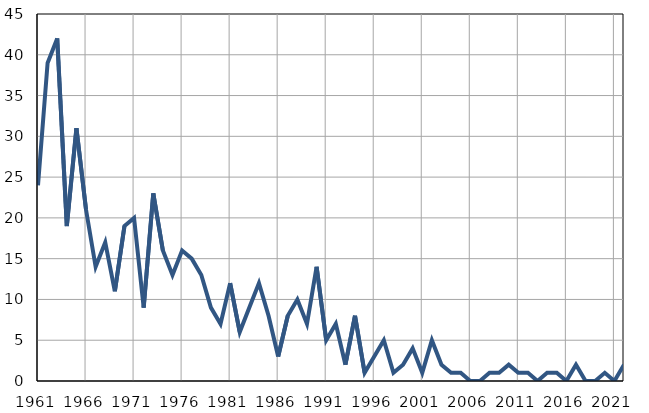
| Category | Infants
deaths |
|---|---|
| 1961.0 | 24 |
| 1962.0 | 39 |
| 1963.0 | 42 |
| 1964.0 | 19 |
| 1965.0 | 31 |
| 1966.0 | 21 |
| 1967.0 | 14 |
| 1968.0 | 17 |
| 1969.0 | 11 |
| 1970.0 | 19 |
| 1971.0 | 20 |
| 1972.0 | 9 |
| 1973.0 | 23 |
| 1974.0 | 16 |
| 1975.0 | 13 |
| 1976.0 | 16 |
| 1977.0 | 15 |
| 1978.0 | 13 |
| 1979.0 | 9 |
| 1980.0 | 7 |
| 1981.0 | 12 |
| 1982.0 | 6 |
| 1983.0 | 9 |
| 1984.0 | 12 |
| 1985.0 | 8 |
| 1986.0 | 3 |
| 1987.0 | 8 |
| 1988.0 | 10 |
| 1989.0 | 7 |
| 1990.0 | 14 |
| 1991.0 | 5 |
| 1992.0 | 7 |
| 1993.0 | 2 |
| 1994.0 | 8 |
| 1995.0 | 1 |
| 1996.0 | 3 |
| 1997.0 | 5 |
| 1998.0 | 1 |
| 1999.0 | 2 |
| 2000.0 | 4 |
| 2001.0 | 1 |
| 2002.0 | 5 |
| 2003.0 | 2 |
| 2004.0 | 1 |
| 2005.0 | 1 |
| 2006.0 | 0 |
| 2007.0 | 0 |
| 2008.0 | 1 |
| 2009.0 | 1 |
| 2010.0 | 2 |
| 2011.0 | 1 |
| 2012.0 | 1 |
| 2013.0 | 0 |
| 2014.0 | 1 |
| 2015.0 | 1 |
| 2016.0 | 0 |
| 2017.0 | 2 |
| 2018.0 | 0 |
| 2019.0 | 0 |
| 2020.0 | 1 |
| 2021.0 | 0 |
| 2022.0 | 2 |